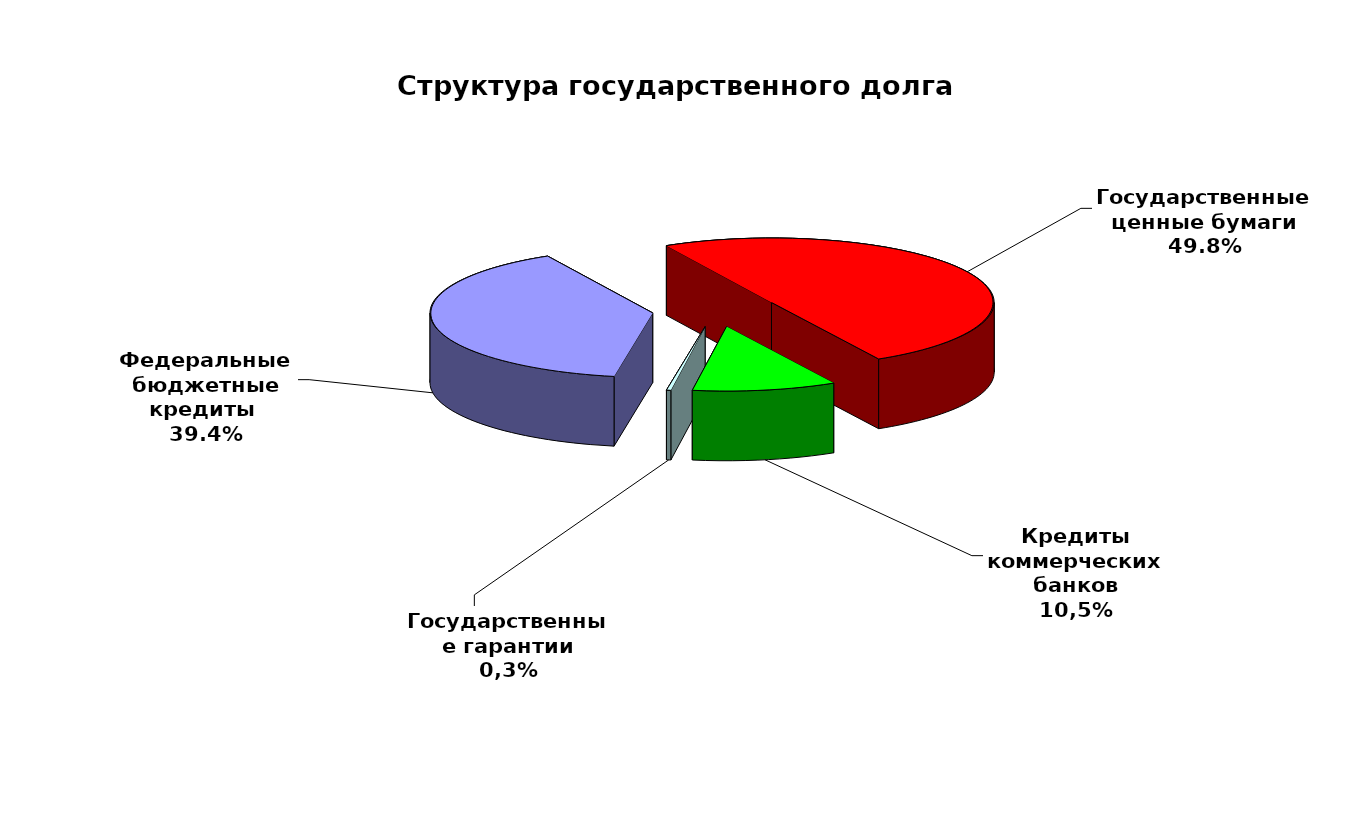
| Category | Series 0 |
|---|---|
| Федеральные бюджетные кредиты  | 28702553.563 |
| Государственные ценные бумаги | 36300000 |
| Кредиты коммерческих банков | 7612182 |
| Государственные гарантии | 232477.01 |